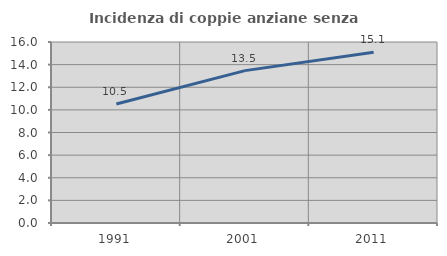
| Category | Incidenza di coppie anziane senza figli  |
|---|---|
| 1991.0 | 10.514 |
| 2001.0 | 13.471 |
| 2011.0 | 15.086 |